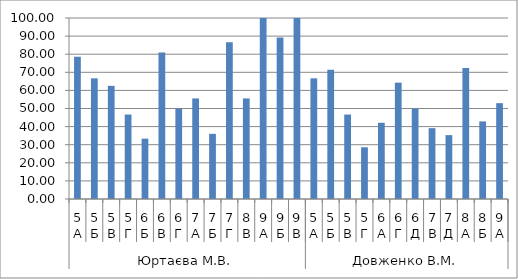
| Category | Series 0 |
|---|---|
| 0 | 78.571 |
| 1 | 66.667 |
| 2 | 62.5 |
| 3 | 46.667 |
| 4 | 33.333 |
| 5 | 80.952 |
| 6 | 50 |
| 7 | 55.556 |
| 8 | 36 |
| 9 | 86.667 |
| 10 | 55.556 |
| 11 | 100 |
| 12 | 89.286 |
| 13 | 100 |
| 14 | 66.667 |
| 15 | 71.429 |
| 16 | 46.667 |
| 17 | 28.571 |
| 18 | 42.105 |
| 19 | 64.286 |
| 20 | 50 |
| 21 | 39.13 |
| 22 | 35.294 |
| 23 | 72.414 |
| 24 | 42.857 |
| 25 | 52.941 |